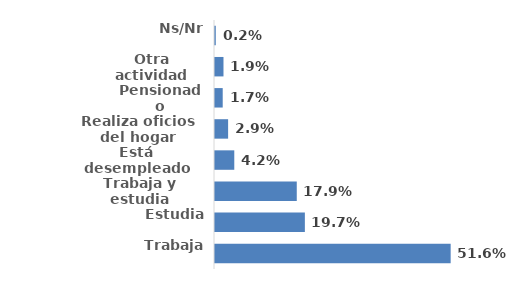
| Category | Series 0 |
|---|---|
| Trabaja | 0.516 |
| Estudia | 0.197 |
| Trabaja y estudia | 0.179 |
| Está desempleado | 0.042 |
| Realiza oficios del hogar | 0.029 |
| Pensionado | 0.017 |
| Otra actividad | 0.019 |
| Ns/Nr | 0.002 |